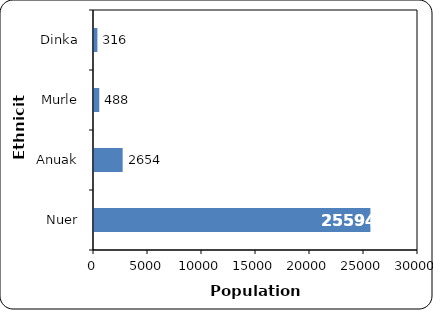
| Category | Number |
|---|---|
| Nuer | 25594 |
| Anuak | 2654 |
| Murle | 488 |
| Dinka | 316 |